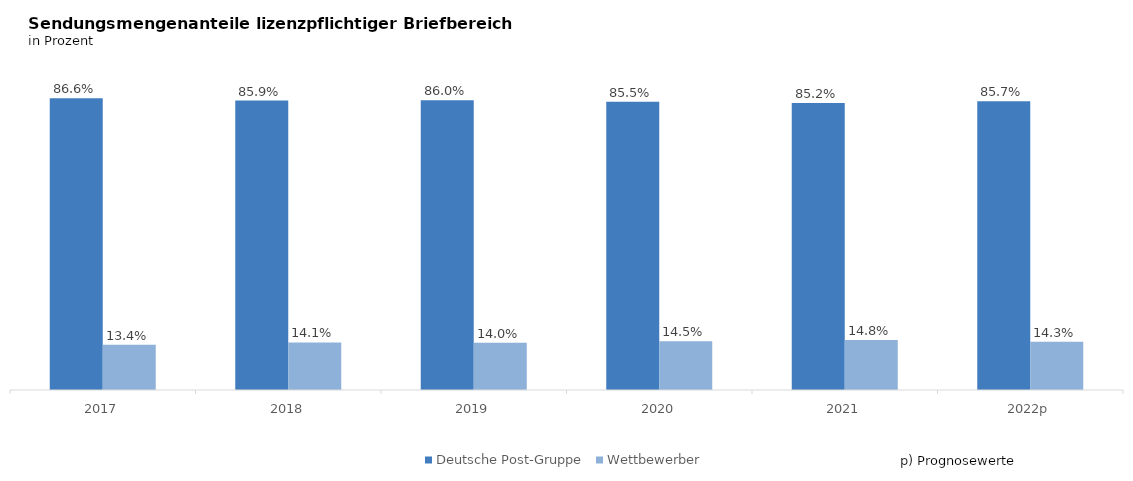
| Category | Deutsche Post-Gruppe | Wettbewerber |
|---|---|---|
| 2017 | 0.866 | 0.134 |
| 2018 | 0.859 | 0.141 |
| 2019 | 0.86 | 0.14 |
| 2020 | 0.855 | 0.145 |
| 2021 | 0.852 | 0.148 |
| 2022p | 0.857 | 0.143 |